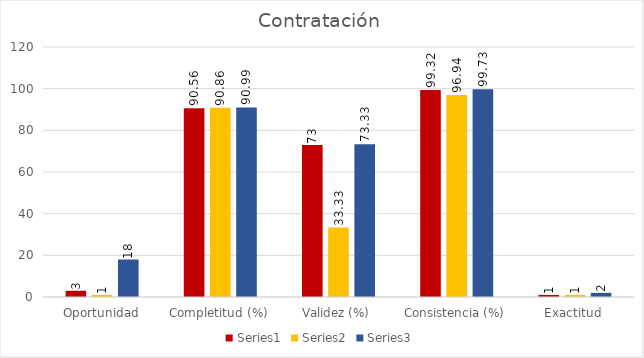
| Category | Series 0 | Series 1 | Series 2 |
|---|---|---|---|
| Oportunidad | 3 | 1 | 18 |
| Completitud (%) | 90.56 | 90.86 | 90.99 |
| Validez (%) | 73 | 33.33 | 73.33 |
| Consistencia (%) | 99.32 | 96.94 | 99.73 |
| Exactitud | 1 | 1 | 2 |